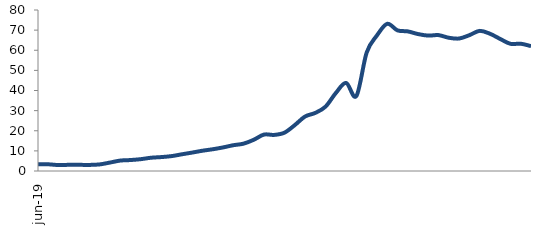
| Category | Series 0 |
|---|---|
| 2019-06-01 | 3.379 |
| 2019-07-01 | 3.329 |
| 2019-08-01 | 2.95 |
| 2019-09-01 | 3.068 |
| 2019-10-01 | 3.068 |
| 2019-11-01 | 3.019 |
| 2019-12-01 | 3.273 |
| 2020-01-01 | 4.186 |
| 2020-02-01 | 5.17 |
| 2020-03-01 | 5.444 |
| 2020-04-01 | 5.874 |
| 2020-05-01 | 6.591 |
| 2020-06-01 | 6.913 |
| 2020-07-01 | 7.395 |
| 2020-08-01 | 8.292 |
| 2020-09-01 | 9.145 |
| 2020-10-01 | 10.067 |
| 2020-11-01 | 10.794 |
| 2020-12-01 | 11.695 |
| 2021-01-01 | 12.796 |
| 2021-02-01 | 13.569 |
| 2021-03-01 | 15.494 |
| 2021-04-01 | 18.102 |
| 2021-05-01 | 17.933 |
| 2021-06-01 | 19.058 |
| 2021-07-01 | 22.799 |
| 2021-08-01 | 27.071 |
| 2021-09-01 | 28.872 |
| 2021-10-01 | 32.01 |
| 2021-11-01 | 38.771 |
| 2021-12-01 | 43.773 |
| 2022-01-01 | 37.28 |
| 2022-02-01 | 58.857 |
| 2022-03-01 | 67.349 |
| 2022-04-01 | 73.13 |
| 2022-05-01 | 69.874 |
| 2022-06-01 | 69.376 |
| 2022-07-01 | 68.04 |
| 2022-08-01 | 67.278 |
| 2022-09-01 | 67.518 |
| 2022-10-01 | 66.201 |
| 2022-11-01 | 65.824 |
| 2022-12-01 | 67.5 |
| 2023-01-01 | 69.621 |
| 2023-02-01 | 68.213 |
| 2023-03-01 | 65.618 |
| 2023-04-01 | 63.206 |
| 2023-05-01 | 63.235 |
| 2023-06-01 | 62.047 |